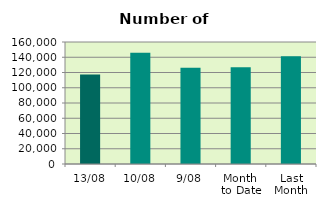
| Category | Series 0 |
|---|---|
| 13/08 | 117376 |
| 10/08 | 145994 |
| 9/08 | 126256 |
| Month 
to Date | 126864.444 |
| Last
Month | 141432.273 |